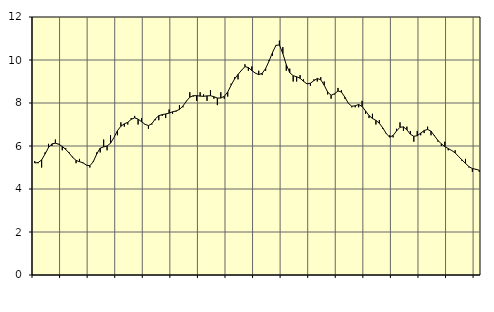
| Category | Piggar | Series 1 |
|---|---|---|
| nan | 5.3 | 5.21 |
| 87.0 | 5.2 | 5.23 |
| 87.0 | 5 | 5.35 |
| 87.0 | 5.7 | 5.63 |
| nan | 6.1 | 5.93 |
| 88.0 | 6 | 6.1 |
| 88.0 | 6.3 | 6.13 |
| 88.0 | 6.1 | 6.08 |
| nan | 5.8 | 5.98 |
| 89.0 | 5.9 | 5.84 |
| 89.0 | 5.7 | 5.67 |
| 89.0 | 5.5 | 5.47 |
| nan | 5.2 | 5.33 |
| 90.0 | 5.4 | 5.27 |
| 90.0 | 5.2 | 5.22 |
| 90.0 | 5.1 | 5.11 |
| nan | 5 | 5.08 |
| 91.0 | 5.3 | 5.27 |
| 91.0 | 5.7 | 5.63 |
| 91.0 | 5.7 | 5.9 |
| nan | 6.3 | 5.96 |
| 92.0 | 5.8 | 6 |
| 92.0 | 6.5 | 6.13 |
| 92.0 | 6.4 | 6.4 |
| nan | 6.5 | 6.71 |
| 93.0 | 7.1 | 6.92 |
| 93.0 | 6.9 | 7.03 |
| 93.0 | 7 | 7.1 |
| nan | 7.3 | 7.24 |
| 94.0 | 7.4 | 7.31 |
| 94.0 | 7 | 7.25 |
| 94.0 | 7.3 | 7.13 |
| nan | 7 | 7.01 |
| 95.0 | 6.8 | 6.95 |
| 95.0 | 7 | 7.04 |
| 95.0 | 7.2 | 7.26 |
| nan | 7.2 | 7.41 |
| 96.0 | 7.4 | 7.46 |
| 96.0 | 7.3 | 7.49 |
| 96.0 | 7.7 | 7.53 |
| nan | 7.5 | 7.59 |
| 97.0 | 7.6 | 7.63 |
| 97.0 | 7.9 | 7.7 |
| 97.0 | 7.8 | 7.86 |
| nan | 8.1 | 8.08 |
| 98.0 | 8.5 | 8.27 |
| 98.0 | 8.3 | 8.34 |
| 98.0 | 8.1 | 8.34 |
| nan | 8.5 | 8.32 |
| 99.0 | 8.4 | 8.31 |
| 99.0 | 8.1 | 8.33 |
| 99.0 | 8.6 | 8.34 |
| nan | 8.2 | 8.29 |
| 0.0 | 7.9 | 8.23 |
| 0.0 | 8.5 | 8.23 |
| 0.0 | 8.2 | 8.31 |
| nan | 8.3 | 8.51 |
| 1.0 | 8.9 | 8.83 |
| 1.0 | 9.2 | 9.12 |
| 1.0 | 9.1 | 9.33 |
| nan | 9.5 | 9.52 |
| 2.0 | 9.8 | 9.69 |
| 2.0 | 9.5 | 9.65 |
| 2.0 | 9.7 | 9.51 |
| nan | 9.4 | 9.39 |
| 3.0 | 9.5 | 9.32 |
| 3.0 | 9.3 | 9.38 |
| 3.0 | 9.5 | 9.6 |
| nan | 10 | 9.95 |
| 4.0 | 10.2 | 10.35 |
| 4.0 | 10.7 | 10.68 |
| 4.0 | 10.9 | 10.7 |
| nan | 10.6 | 10.3 |
| 5.0 | 9.5 | 9.78 |
| 5.0 | 9.6 | 9.41 |
| 5.0 | 9 | 9.27 |
| nan | 9 | 9.22 |
| 6.0 | 9.3 | 9.15 |
| 6.0 | 9.1 | 9.01 |
| 6.0 | 8.9 | 8.89 |
| nan | 8.8 | 8.92 |
| 7.0 | 9.1 | 9.04 |
| 7.0 | 9 | 9.14 |
| 7.0 | 9.2 | 9.08 |
| nan | 9 | 8.83 |
| 8.0 | 8.4 | 8.51 |
| 8.0 | 8.2 | 8.36 |
| 8.0 | 8.4 | 8.43 |
| nan | 8.7 | 8.56 |
| 9.0 | 8.6 | 8.51 |
| 9.0 | 8.2 | 8.27 |
| 9.0 | 8 | 7.99 |
| nan | 7.8 | 7.85 |
| 10.0 | 7.8 | 7.87 |
| 10.0 | 7.8 | 7.93 |
| 10.0 | 8.1 | 7.84 |
| nan | 7.5 | 7.63 |
| 11.0 | 7.3 | 7.42 |
| 11.0 | 7.5 | 7.28 |
| 11.0 | 7 | 7.19 |
| nan | 7.2 | 7.06 |
| 12.0 | 6.8 | 6.84 |
| 12.0 | 6.6 | 6.58 |
| 12.0 | 6.5 | 6.41 |
| nan | 6.4 | 6.49 |
| 13.0 | 6.8 | 6.7 |
| 13.0 | 7.1 | 6.87 |
| 13.0 | 6.7 | 6.89 |
| nan | 6.9 | 6.75 |
| 14.0 | 6.7 | 6.55 |
| 14.0 | 6.2 | 6.45 |
| 14.0 | 6.7 | 6.48 |
| nan | 6.5 | 6.6 |
| 15.0 | 6.6 | 6.72 |
| 15.0 | 6.9 | 6.77 |
| 15.0 | 6.5 | 6.69 |
| nan | 6.5 | 6.47 |
| 16.0 | 6.2 | 6.26 |
| 16.0 | 6 | 6.1 |
| 16.0 | 6.2 | 5.97 |
| nan | 5.8 | 5.88 |
| 17.0 | 5.8 | 5.79 |
| 17.0 | 5.8 | 5.68 |
| 17.0 | 5.5 | 5.51 |
| nan | 5.3 | 5.35 |
| 18.0 | 5.4 | 5.19 |
| 18.0 | 5 | 5.04 |
| 18.0 | 4.8 | 4.95 |
| nan | 4.9 | 4.92 |
| 19.0 | 4.8 | 4.87 |